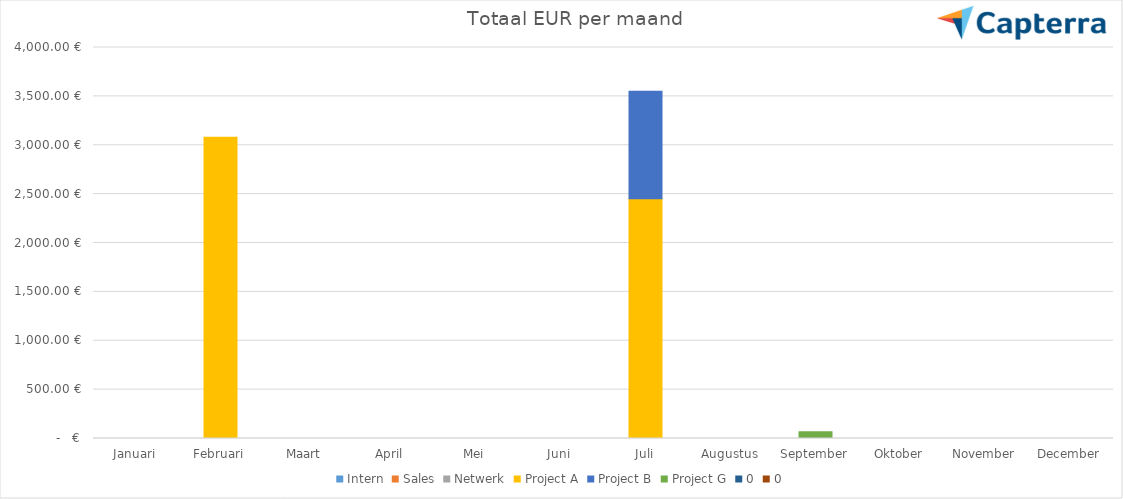
| Category | Intern | Sales | Netwerk | Project A | Project B | Project G | 0 |
|---|---|---|---|---|---|---|---|
| Januari | 0 | 0 | 0 | 0 | 0 | 0 | 0 |
| Februari | 0 | 0 | 0 | 3082.5 | 0 | 0 | 0 |
| Maart | 0 | 0 | 0 | 0 | 0 | 0 | 0 |
| April | 0 | 0 | 0 | 0 | 0 | 0 | 0 |
| Mei | 0 | 0 | 0 | 0 | 0 | 0 | 0 |
| Juni | 0 | 0 | 0 | 0 | 0 | 0 | 0 |
| Juli | 0 | 0 | 0 | 2452.5 | 1100 | 0 | 0 |
| Augustus | 0 | 0 | 0 | 0 | 0 | 0 | 0 |
| September | 0 | 0 | 0 | 0 | 0 | 70 | 0 |
| Oktober | 0 | 0 | 0 | 0 | 0 | 0 | 0 |
| November | 0 | 0 | 0 | 0 | 0 | 0 | 0 |
| December | 0 | 0 | 0 | 0 | 0 | 0 | 0 |